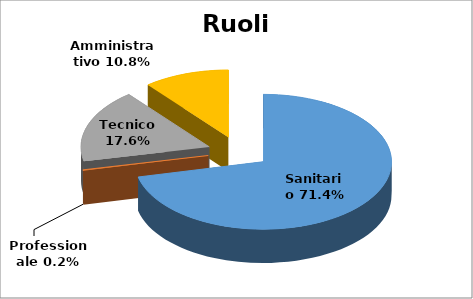
| Category | Series 0 |
|---|---|
| Sanitario | 0.714 |
| Professionale | 0.002 |
| Tecnico | 0.176 |
| Amministrativo | 0.108 |